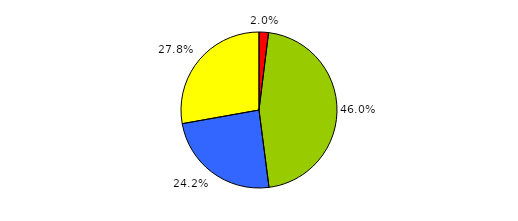
| Category | Series 0 |
|---|---|
| 0 | 11 |
| 1 | 258 |
| 2 | 136 |
| 3 | 156 |